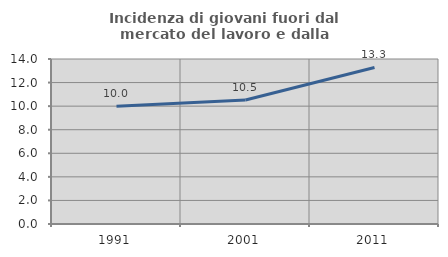
| Category | Incidenza di giovani fuori dal mercato del lavoro e dalla formazione  |
|---|---|
| 1991.0 | 10 |
| 2001.0 | 10.526 |
| 2011.0 | 13.281 |